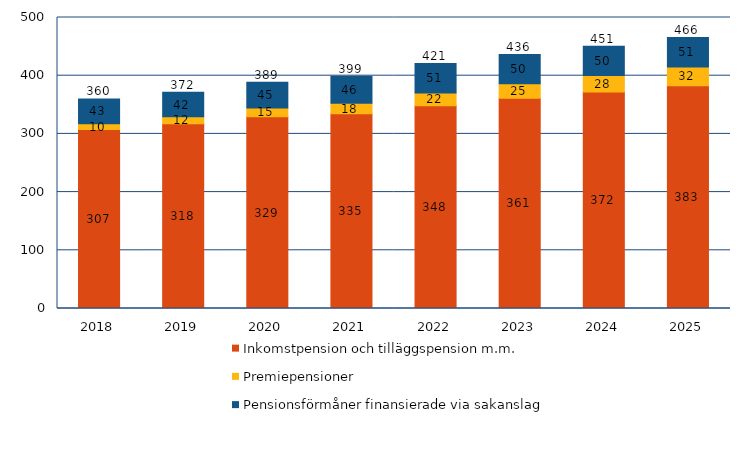
| Category | Inkomstpension och tilläggspension m.m. | Premiepensioner | Pensionsförmåner finansierade via sakanslag | Series 3 |
|---|---|---|---|---|
| 2018.0 | 307.356 | 10.141 | 42.55 | 360.046 |
| 2019.0 | 317.628 | 11.715 | 42.22 | 371.563 |
| 2020.0 | 329.365 | 15.016 | 44.546 | 388.927 |
| 2021.0 | 334.706 | 17.834 | 46.307 | 398.847 |
| 2022.0 | 348.454 | 21.789 | 50.893 | 421.136 |
| 2023.0 | 361.223 | 24.952 | 50.316 | 436.492 |
| 2024.0 | 372.046 | 28.373 | 50.298 | 450.717 |
| 2025.0 | 382.84 | 32.084 | 50.602 | 465.526 |